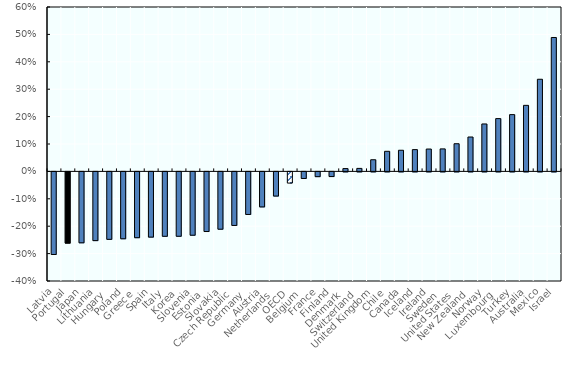
| Category | 20-64 |
|---|---|
|          Latvia | -0.301 |
|          Portugal | -0.26 |
|          Japan | -0.259 |
|          Lithuania | -0.251 |
|          Hungary | -0.246 |
|          Poland | -0.244 |
|          Greece | -0.24 |
|          Spain | -0.238 |
| Italy | -0.235 |
|  Korea | -0.235 |
|          Slovenia | -0.231 |
|          Estonia | -0.218 |
|          Slovakia | -0.209 |
| Czech Republic | -0.195 |
|          Germany | -0.155 |
|          Austria | -0.128 |
|          Netherlands | -0.088 |
| OECD | -0.041 |
|          Belgium | -0.024 |
|          France | -0.017 |
|          Finland | -0.017 |
|          Denmark | 0.01 |
|          Switzerland | 0.011 |
|          United Kingdom | 0.043 |
| Chile | 0.073 |
|       Canada | 0.077 |
|          Iceland | 0.079 |
|          Ireland | 0.082 |
|          Sweden | 0.082 |
|       United States | 0.101 |
| New Zealand | 0.126 |
|          Norway | 0.173 |
|          Luxembourg | 0.193 |
|          Turkey | 0.207 |
|          Australia | 0.241 |
|          Mexico | 0.336 |
|          Israel | 0.489 |